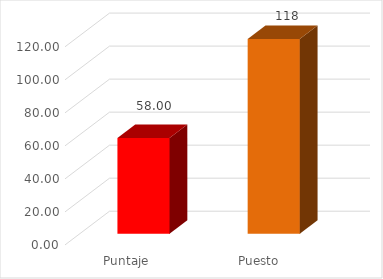
| Category | Series 0 |
|---|---|
| Puntaje  | 58 |
| Puesto | 118 |